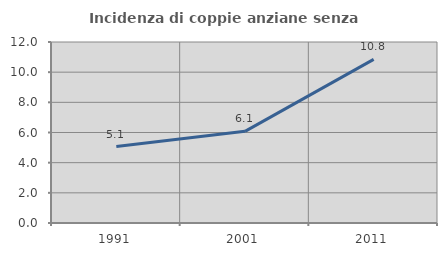
| Category | Incidenza di coppie anziane senza figli  |
|---|---|
| 1991.0 | 5.066 |
| 2001.0 | 6.078 |
| 2011.0 | 10.847 |